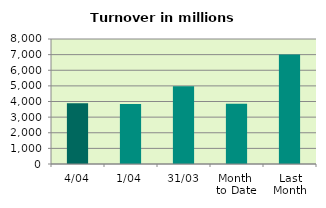
| Category | Series 0 |
|---|---|
| 4/04 | 3880.458 |
| 1/04 | 3835.529 |
| 31/03 | 4969.333 |
| Month 
to Date | 3857.994 |
| Last
Month | 7002.451 |